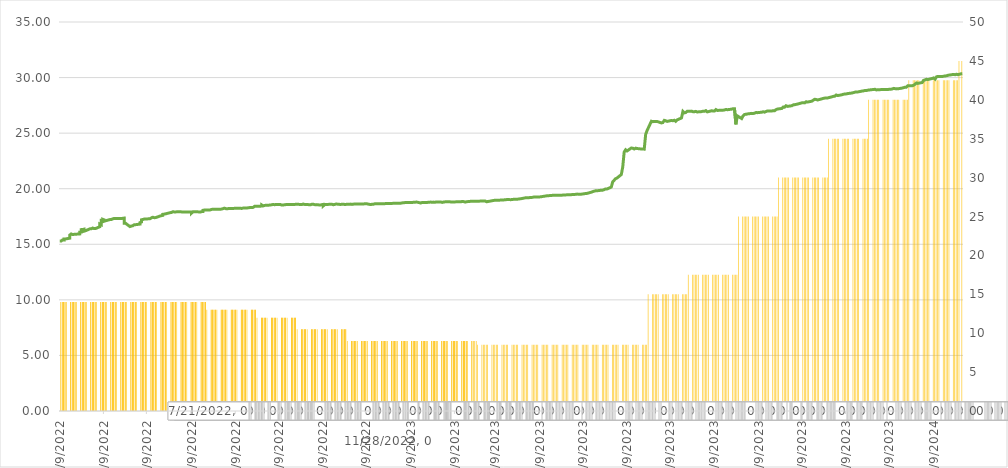
| Category | Politika Faizi |
|---|---|
| 0 | 45 |
| 1/1/00 | 45 |
| 1/2/00 | 45 |
| 1/3/00 | 42.5 |
| 1/4/00 | 42.5 |
| 1/5/00 | 42.5 |
| 1/6/00 | 42.5 |
| 1/7/00 | 42.5 |
| 1/8/00 | 42.5 |
| 1/9/00 | 42.5 |
| 1/10/00 | 42.5 |
| 1/11/00 | 42.5 |
| 1/12/00 | 42.5 |
| 1/13/00 | 42.5 |
| 1/14/00 | 42.5 |
| 1/15/00 | 42.5 |
| 1/16/00 | 42.5 |
| 1/17/00 | 42.5 |
| 1/18/00 | 42.5 |
| 1/19/00 | 42.5 |
| 1/20/00 | 42.5 |
| 1/21/00 | 42.5 |
| 1/22/00 | 42.5 |
| 1/23/00 | 42.5 |
| 1/24/00 | 42.5 |
| 1/25/00 | 42.5 |
| 1/26/00 | 42.5 |
| 1/27/00 | 42.5 |
| 1/28/00 | 40 |
| 1/29/00 | 40 |
| 1/30/00 | 40 |
| 1/31/00 | 40 |
| 2/1/00 | 40 |
| 2/2/00 | 40 |
| 2/3/00 | 40 |
| 2/4/00 | 40 |
| 2/5/00 | 40 |
| 2/6/00 | 40 |
| 2/7/00 | 40 |
| 2/8/00 | 40 |
| 2/9/00 | 40 |
| 2/10/00 | 40 |
| 2/11/00 | 40 |
| 2/12/00 | 40 |
| 2/13/00 | 40 |
| 2/14/00 | 40 |
| 2/15/00 | 40 |
| 2/16/00 | 40 |
| 2/17/00 | 35 |
| 2/18/00 | 35 |
| 2/19/00 | 35 |
| 2/20/00 | 35 |
| 2/21/00 | 35 |
| 2/22/00 | 35 |
| 2/23/00 | 35 |
| 2/24/00 | 35 |
| 2/25/00 | 35 |
| 2/26/00 | 35 |
| 2/27/00 | 35 |
| 2/28/00 | 35 |
| 2/28/00 | 35 |
| 3/1/00 | 35 |
| 3/2/00 | 35 |
| 3/3/00 | 35 |
| 3/4/00 | 35 |
| 3/5/00 | 35 |
| 3/6/00 | 35 |
| 3/7/00 | 35 |
| 3/8/00 | 30 |
| 3/9/00 | 30 |
| 3/10/00 | 30 |
| 3/11/00 | 30 |
| 3/12/00 | 30 |
| 3/13/00 | 30 |
| 3/14/00 | 30 |
| 3/15/00 | 30 |
| 3/16/00 | 30 |
| 3/17/00 | 30 |
| 3/18/00 | 30 |
| 3/19/00 | 30 |
| 3/20/00 | 30 |
| 3/21/00 | 30 |
| 3/22/00 | 30 |
| 3/23/00 | 30 |
| 3/24/00 | 30 |
| 3/25/00 | 30 |
| 3/26/00 | 30 |
| 3/27/00 | 30 |
| 3/28/00 | 30 |
| 3/29/00 | 30 |
| 3/30/00 | 30 |
| 3/31/00 | 30 |
| 4/1/00 | 30 |
| 4/2/00 | 25 |
| 4/3/00 | 25 |
| 4/4/00 | 25 |
| 4/5/00 | 25 |
| 4/6/00 | 25 |
| 4/7/00 | 25 |
| 4/8/00 | 25 |
| 4/9/00 | 25 |
| 4/10/00 | 25 |
| 4/11/00 | 25 |
| 4/12/00 | 25 |
| 4/13/00 | 25 |
| 4/14/00 | 25 |
| 4/15/00 | 25 |
| 4/16/00 | 25 |
| 4/17/00 | 25 |
| 4/18/00 | 25 |
| 4/19/00 | 25 |
| 4/20/00 | 25 |
| 4/21/00 | 25 |
| 4/22/00 | 17.5 |
| 4/23/00 | 17.5 |
| 4/24/00 | 17.5 |
| 4/25/00 | 17.5 |
| 4/26/00 | 17.5 |
| 4/27/00 | 17.5 |
| 4/28/00 | 17.5 |
| 4/29/00 | 17.5 |
| 4/30/00 | 17.5 |
| 5/1/00 | 17.5 |
| 5/2/00 | 17.5 |
| 5/3/00 | 17.5 |
| 5/4/00 | 17.5 |
| 5/5/00 | 17.5 |
| 5/6/00 | 17.5 |
| 5/7/00 | 17.5 |
| 5/8/00 | 17.5 |
| 5/9/00 | 17.5 |
| 5/10/00 | 17.5 |
| 5/11/00 | 17.5 |
| 5/12/00 | 17.5 |
| 5/13/00 | 17.5 |
| 5/14/00 | 17.5 |
| 5/15/00 | 17.5 |
| 5/16/00 | 17.5 |
| 5/17/00 | 15 |
| 5/18/00 | 15 |
| 5/19/00 | 15 |
| 5/20/00 | 15 |
| 5/21/00 | 15 |
| 5/22/00 | 15 |
| 5/23/00 | 15 |
| 5/24/00 | 15 |
| 5/25/00 | 15 |
| 5/26/00 | 15 |
| 5/27/00 | 15 |
| 5/28/00 | 15 |
| 5/29/00 | 15 |
| 5/30/00 | 15 |
| 5/31/00 | 15 |
| 6/1/00 | 15 |
| 6/2/00 | 15 |
| 6/3/00 | 15 |
| 6/4/00 | 15 |
| 6/5/00 | 15 |
| 6/6/00 | 8.5 |
| 6/7/00 | 8.5 |
| 6/8/00 | 8.5 |
| 6/9/00 | 8.5 |
| 6/10/00 | 8.5 |
| 6/11/00 | 8.5 |
| 6/12/00 | 8.5 |
| 6/13/00 | 8.5 |
| 6/14/00 | 8.5 |
| 6/15/00 | 8.5 |
| 6/16/00 | 8.5 |
| 6/17/00 | 8.5 |
| 6/18/00 | 8.5 |
| 6/19/00 | 8.5 |
| 6/20/00 | 8.5 |
| 6/21/00 | 8.5 |
| 6/22/00 | 8.5 |
| 6/23/00 | 8.5 |
| 6/24/00 | 8.5 |
| 6/25/00 | 8.5 |
| 6/26/00 | 8.5 |
| 6/27/00 | 8.5 |
| 6/28/00 | 8.5 |
| 6/29/00 | 8.5 |
| 6/30/00 | 8.5 |
| 7/1/00 | 8.5 |
| 7/2/00 | 8.5 |
| 7/3/00 | 8.5 |
| 7/4/00 | 8.5 |
| 7/5/00 | 8.5 |
| 7/6/00 | 8.5 |
| 7/7/00 | 8.5 |
| 7/8/00 | 8.5 |
| 7/9/00 | 8.5 |
| 7/10/00 | 8.5 |
| 7/11/00 | 8.5 |
| 7/12/00 | 8.5 |
| 7/13/00 | 8.5 |
| 7/14/00 | 8.5 |
| 7/15/00 | 8.5 |
| 7/16/00 | 8.5 |
| 7/17/00 | 8.5 |
| 7/18/00 | 8.5 |
| 7/19/00 | 8.5 |
| 7/20/00 | 8.5 |
| 7/21/00 | 8.5 |
| 7/22/00 | 8.5 |
| 7/23/00 | 8.5 |
| 7/24/00 | 8.5 |
| 7/25/00 | 8.5 |
| 7/26/00 | 8.5 |
| 7/27/00 | 8.5 |
| 7/28/00 | 8.5 |
| 7/29/00 | 8.5 |
| 7/30/00 | 8.5 |
| 7/31/00 | 8.5 |
| 8/1/00 | 8.5 |
| 8/2/00 | 8.5 |
| 8/3/00 | 8.5 |
| 8/4/00 | 8.5 |
| 8/5/00 | 8.5 |
| 8/6/00 | 8.5 |
| 8/7/00 | 8.5 |
| 8/8/00 | 8.5 |
| 8/9/00 | 8.5 |
| 8/10/00 | 8.5 |
| 8/11/00 | 8.5 |
| 8/12/00 | 8.5 |
| 8/13/00 | 8.5 |
| 8/14/00 | 8.5 |
| 8/15/00 | 8.5 |
| 8/16/00 | 8.5 |
| 8/17/00 | 8.5 |
| 8/18/00 | 8.5 |
| 8/19/00 | 8.5 |
| 8/20/00 | 8.5 |
| 8/21/00 | 8.5 |
| 8/22/00 | 8.5 |
| 8/23/00 | 8.5 |
| 8/24/00 | 8.5 |
| 8/25/00 | 8.5 |
| 8/26/00 | 8.5 |
| 8/27/00 | 8.5 |
| 8/28/00 | 8.5 |
| 8/29/00 | 8.5 |
| 8/30/00 | 9 |
| 8/31/00 | 9 |
| 9/1/00 | 9 |
| 9/2/00 | 9 |
| 9/3/00 | 9 |
| 9/4/00 | 9 |
| 9/5/00 | 9 |
| 9/6/00 | 9 |
| 9/7/00 | 9 |
| 9/8/00 | 9 |
| 9/9/00 | 9 |
| 9/10/00 | 9 |
| 9/11/00 | 9 |
| 9/12/00 | 9 |
| 9/13/00 | 9 |
| 9/14/00 | 9 |
| 9/15/00 | 9 |
| 9/16/00 | 9 |
| 9/17/00 | 9 |
| 9/18/00 | 9 |
| 9/19/00 | 9 |
| 9/20/00 | 9 |
| 9/21/00 | 9 |
| 9/22/00 | 9 |
| 9/23/00 | 9 |
| 9/24/00 | 9 |
| 9/25/00 | 9 |
| 9/26/00 | 9 |
| 9/27/00 | 9 |
| 9/28/00 | 9 |
| 9/29/00 | 9 |
| 9/30/00 | 9 |
| 10/1/00 | 9 |
| 10/2/00 | 9 |
| 10/3/00 | 9 |
| 10/4/00 | 9 |
| 10/5/00 | 9 |
| 10/6/00 | 9 |
| 10/7/00 | 9 |
| 10/8/00 | 9 |
| 10/9/00 | 9 |
| 10/10/00 | 9 |
| 10/11/00 | 9 |
| 10/12/00 | 9 |
| 10/13/00 | 9 |
| 10/14/00 | 9 |
| 10/15/00 | 9 |
| 10/16/00 | 9 |
| 10/17/00 | 9 |
| 10/18/00 | 9 |
| 10/19/00 | 9 |
| 10/20/00 | 9 |
| 10/21/00 | 9 |
| 10/22/00 | 9 |
| 10/23/00 | 9 |
| 10/24/00 | 9 |
| 10/25/00 | 9 |
| 10/26/00 | 9 |
| 10/27/00 | 9 |
| 10/28/00 | 9 |
| 10/29/00 | 9 |
| 10/30/00 | 9 |
| 10/31/00 | 9 |
| 11/1/00 | 9 |
| 11/2/00 | 9 |
| 11/3/00 | 9 |
| 11/4/00 | 9 |
| 11/5/00 | 9 |
| 11/6/00 | 9 |
| 11/7/00 | 9 |
| 11/8/00 | 9 |
| 11/9/00 | 9 |
| 11/10/00 | 9 |
| 11/11/00 | 9 |
| 11/12/00 | 9 |
| 11/13/00 | 9 |
| 11/14/00 | 9 |
| 11/15/00 | 9 |
| 11/16/00 | 9 |
| 11/17/00 | 9 |
| 11/18/00 | 9 |
| 11/19/00 | 9 |
| 11/20/00 | 9 |
| 11/21/00 | 9 |
| 11/22/00 | 9 |
| 11/23/00 | 9 |
| 11/24/00 | 9 |
| 11/25/00 | 9 |
| 11/26/00 | 9 |
| 11/27/00 | 9 |
| 11/28/00 | 9 |
| 11/29/00 | 9 |
| 11/30/00 | 9 |
| 12/1/00 | 9 |
| 12/2/00 | 9 |
| 12/3/00 | 9 |
| 12/4/00 | 9 |
| 12/5/00 | 9 |
| 12/6/00 | 9 |
| 12/7/00 | 9 |
| 12/8/00 | 9 |
| 12/9/00 | 9 |
| 12/10/00 | 9 |
| 12/11/00 | 9 |
| 12/12/00 | 9 |
| 12/13/00 | 9 |
| 12/14/00 | 9 |
| 12/15/00 | 9 |
| 12/16/00 | 9 |
| 12/17/00 | 9 |
| 12/18/00 | 9 |
| 12/19/00 | 9 |
| 12/20/00 | 9 |
| 12/21/00 | 9 |
| 12/22/00 | 10.5 |
| 12/23/00 | 10.5 |
| 12/24/00 | 10.5 |
| 12/25/00 | 10.5 |
| 12/26/00 | 10.5 |
| 12/27/00 | 10.5 |
| 12/28/00 | 10.5 |
| 12/29/00 | 10.5 |
| 12/30/00 | 10.5 |
| 12/31/00 | 10.5 |
| 1/1/01 | 10.5 |
| 1/2/01 | 10.5 |
| 1/3/01 | 10.5 |
| 1/4/01 | 10.5 |
| 1/5/01 | 10.5 |
| 1/6/01 | 10.5 |
| 1/7/01 | 10.5 |
| 1/8/01 | 10.5 |
| 1/9/01 | 10.5 |
| 1/10/01 | 10.5 |
| 1/11/01 | 10.5 |
| 1/12/01 | 10.5 |
| 1/13/01 | 10.5 |
| 1/14/01 | 10.5 |
| 1/15/01 | 10.5 |
| 1/16/01 | 10.5 |
| 1/17/01 | 10.5 |
| 1/18/01 | 10.5 |
| 1/19/01 | 10.5 |
| 1/20/01 | 10.5 |
| 1/21/01 | 10.5 |
| 1/22/01 | 10.5 |
| 1/23/01 | 10.5 |
| 1/24/01 | 10.5 |
| 1/25/01 | 10.5 |
| 1/26/01 | 10.5 |
| 1/27/01 | 10.5 |
| 1/28/01 | 10.5 |
| 1/29/01 | 10.5 |
| 1/30/01 | 10.5 |
| 1/31/01 | 10.5 |
| 2/1/01 | 10.5 |
| 2/2/01 | 10.5 |
| 2/3/01 | 10.5 |
| 2/4/01 | 10.5 |
| 2/5/01 | 12 |
| 2/6/01 | 12 |
| 2/7/01 | 12 |
| 2/8/01 | 12 |
| 2/9/01 | 12 |
| 2/10/01 | 12 |
| 2/11/01 | 12 |
| 2/12/01 | 12 |
| 2/13/01 | 12 |
| 2/14/01 | 12 |
| 2/15/01 | 12 |
| 2/16/01 | 12 |
| 2/17/01 | 12 |
| 2/18/01 | 12 |
| 2/19/01 | 12 |
| 2/20/01 | 12 |
| 2/21/01 | 12 |
| 2/22/01 | 12 |
| 2/23/01 | 12 |
| 2/24/01 | 12 |
| 2/25/01 | 12 |
| 2/26/01 | 12 |
| 2/27/01 | 12 |
| 2/28/01 | 12 |
| 3/1/01 | 12 |
| 3/2/01 | 12 |
| 3/3/01 | 12 |
| 3/4/01 | 12 |
| 3/5/01 | 12 |
| 3/6/01 | 12 |
| 3/7/01 | 12 |
| 3/8/01 | 12 |
| 3/9/01 | 12 |
| 3/10/01 | 12 |
| 3/11/01 | 12 |
| 3/12/01 | 12 |
| 3/13/01 | 13 |
| 3/14/01 | 13 |
| 3/15/01 | 13 |
| 3/16/01 | 13 |
| 3/17/01 | 13 |
| 3/18/01 | 13 |
| 3/19/01 | 13 |
| 3/20/01 | 13 |
| 3/21/01 | 13 |
| 3/22/01 | 13 |
| 3/23/01 | 13 |
| 3/24/01 | 13 |
| 3/25/01 | 13 |
| 3/26/01 | 13 |
| 3/27/01 | 13 |
| 3/28/01 | 13 |
| 3/29/01 | 13 |
| 3/30/01 | 13 |
| 3/31/01 | 13 |
| 4/1/01 | 13 |
| 4/2/01 | 13 |
| 4/3/01 | 13 |
| 4/4/01 | 13 |
| 4/5/01 | 13 |
| 4/6/01 | 13 |
| 4/7/01 | 13 |
| 4/8/01 | 13 |
| 4/9/01 | 13 |
| 4/10/01 | 13 |
| 4/11/01 | 13 |
| 4/12/01 | 13 |
| 4/13/01 | 13 |
| 4/14/01 | 13 |
| 4/15/01 | 13 |
| 4/16/01 | 13 |
| 4/17/01 | 13 |
| 4/18/01 | 13 |
| 4/19/01 | 13 |
| 4/20/01 | 13 |
| 4/21/01 | 13 |
| 4/22/01 | 13 |
| 4/23/01 | 13 |
| 4/24/01 | 13 |
| 4/25/01 | 13 |
| 4/26/01 | 13 |
| 4/27/01 | 14 |
| 4/28/01 | 14 |
| 4/29/01 | 14 |
| 4/30/01 | 14 |
| 5/1/01 | 14 |
| 5/2/01 | 14 |
| 5/3/01 | 14 |
| 5/4/01 | 14 |
| 5/5/01 | 14 |
| 5/6/01 | 14 |
| 5/7/01 | 14 |
| 5/8/01 | 14 |
| 5/9/01 | 14 |
| 5/10/01 | 14 |
| 5/11/01 | 14 |
| 5/12/01 | 14 |
| 5/13/01 | 14 |
| 5/14/01 | 14 |
| 5/15/01 | 14 |
| 5/16/01 | 14 |
| 5/17/01 | 14 |
| 5/18/01 | 14 |
| 5/19/01 | 14 |
| 5/20/01 | 14 |
| 5/21/01 | 14 |
| 5/22/01 | 14 |
| 5/23/01 | 14 |
| 5/24/01 | 14 |
| 5/25/01 | 14 |
| 5/26/01 | 14 |
| 5/27/01 | 14 |
| 5/28/01 | 14 |
| 5/29/01 | 14 |
| 5/30/01 | 14 |
| 5/31/01 | 14 |
| 6/1/01 | 14 |
| 6/2/01 | 14 |
| 6/3/01 | 14 |
| 6/4/01 | 14 |
| 6/5/01 | 14 |
| 6/6/01 | 14 |
| 6/7/01 | 14 |
| 6/8/01 | 14 |
| 6/9/01 | 14 |
| 6/10/01 | 14 |
| 6/11/01 | 14 |
| 6/12/01 | 14 |
| 6/13/01 | 14 |
| 6/14/01 | 14 |
| 6/15/01 | 14 |
| 6/16/01 | 14 |
| 6/17/01 | 14 |
| 6/18/01 | 14 |
| 6/19/01 | 14 |
| 6/20/01 | 14 |
| 6/21/01 | 14 |
| 6/22/01 | 14 |
| 6/23/01 | 14 |
| 6/24/01 | 14 |
| 6/25/01 | 14 |
| 6/26/01 | 14 |
| 6/27/01 | 14 |
| 6/28/01 | 14 |
| 6/29/01 | 14 |
| 6/30/01 | 14 |
| 7/1/01 | 14 |
| 7/2/01 | 14 |
| 7/3/01 | 14 |
| 7/4/01 | 14 |
| 7/5/01 | 14 |
| 7/6/01 | 14 |
| 7/7/01 | 14 |
| 7/8/01 | 14 |
| 7/9/01 | 14 |
| 7/10/01 | 14 |
| 7/11/01 | 14 |
| 7/12/01 | 14 |
| 7/13/01 | 14 |
| 7/14/01 | 14 |
| 7/15/01 | 14 |
| 7/16/01 | 14 |
| 7/17/01 | 14 |
| 7/18/01 | 14 |
| 7/19/01 | 14 |
| 7/20/01 | 14 |
| 7/21/01 | 14 |
| 7/22/01 | 14 |
| 7/23/01 | 14 |
| 7/24/01 | 14 |
| 7/25/01 | 14 |
| 7/26/01 | 14 |
| 7/27/01 | 14 |
| 7/28/01 | 14 |
| 7/29/01 | 14 |
| 7/30/01 | 14 |
| 7/31/01 | 14 |
| 8/1/01 | 14 |
| 8/2/01 | 14 |
| 8/3/01 | 14 |
| 8/4/01 | 14 |
| 8/5/01 | 14 |
| 8/6/01 | 14 |
| 8/7/01 | 14 |
| 8/8/01 | 14 |
| 8/9/01 | 14 |
| 8/10/01 | 14 |
| 8/11/01 | 14 |
| 8/12/01 | 14 |
| 8/13/01 | 14 |
| 8/14/01 | 14 |
| 8/15/01 | 14 |
| 8/16/01 | 14 |
| 8/17/01 | 14 |
| 8/18/01 | 14 |
| 8/19/01 | 14 |
| 8/20/01 | 14 |
| 8/21/01 | 14 |
| 8/22/01 | 14 |
| 8/23/01 | 14 |
| 8/24/01 | 14 |
| 8/25/01 | 14 |
| 8/26/01 | 14 |
| 8/27/01 | 14 |
| 8/28/01 | 14 |
| 8/29/01 | 14 |
| 8/30/01 | 14 |
| 8/31/01 | 14 |
| 9/1/01 | 14 |
| 9/2/01 | 14 |
| 9/3/01 | 14 |
| 9/4/01 | 14 |
| 9/5/01 | 14 |
| 9/6/01 | 14 |